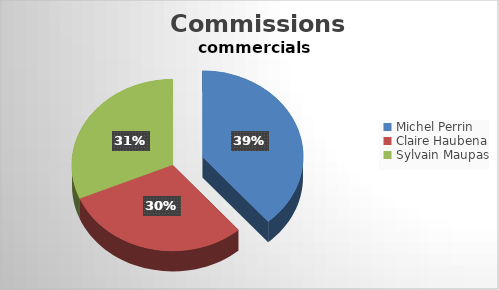
| Category | Series 0 |
|---|---|
| Michel Perrin | 10713.936 |
| Claire Haubena | 8305.624 |
| Sylvain Maupas | 8690.104 |